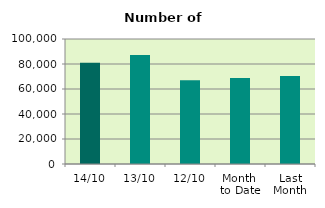
| Category | Series 0 |
|---|---|
| 14/10 | 81080 |
| 13/10 | 87254 |
| 12/10 | 66994 |
| Month 
to Date | 68812.2 |
| Last
Month | 70459.909 |